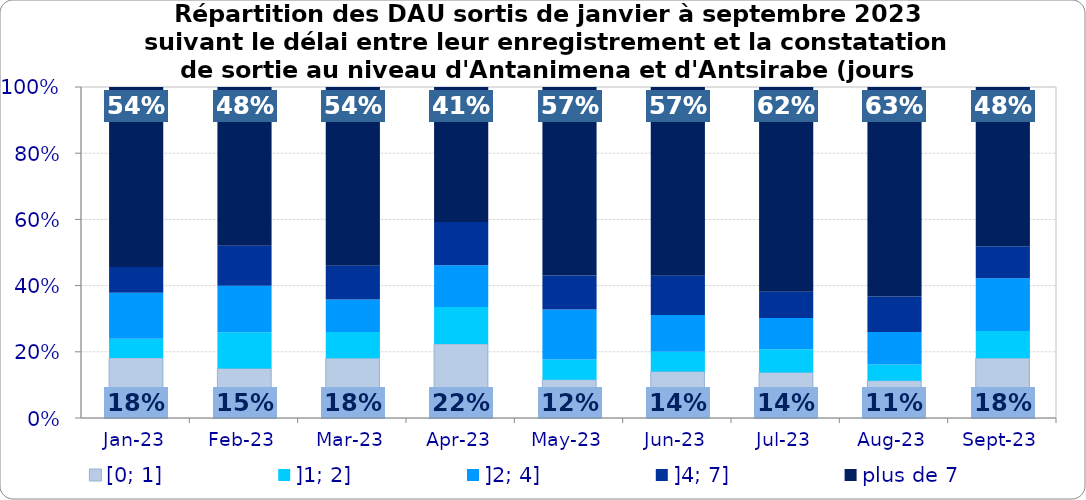
| Category | [0; 1] | ]1; 2] | ]2; 4] | ]4; 7] | plus de 7 |
|---|---|---|---|---|---|
| 2023-01-01 | 0.182 | 0.058 | 0.138 | 0.078 | 0.544 |
| 2023-02-01 | 0.15 | 0.11 | 0.141 | 0.121 | 0.479 |
| 2023-03-01 | 0.18 | 0.079 | 0.099 | 0.102 | 0.54 |
| 2023-04-01 | 0.224 | 0.112 | 0.126 | 0.13 | 0.408 |
| 2023-05-01 | 0.116 | 0.061 | 0.152 | 0.103 | 0.569 |
| 2023-06-01 | 0.14 | 0.06 | 0.111 | 0.119 | 0.57 |
| 2023-07-01 | 0.138 | 0.07 | 0.094 | 0.079 | 0.619 |
| 2023-08-01 | 0.113 | 0.049 | 0.099 | 0.107 | 0.633 |
| 2023-09-01 | 0.181 | 0.082 | 0.159 | 0.097 | 0.481 |